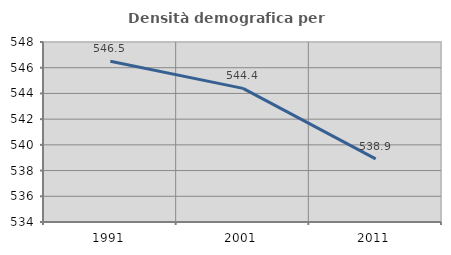
| Category | Densità demografica |
|---|---|
| 1991.0 | 546.507 |
| 2001.0 | 544.392 |
| 2011.0 | 538.911 |